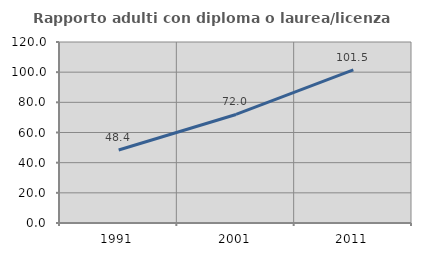
| Category | Rapporto adulti con diploma o laurea/licenza media  |
|---|---|
| 1991.0 | 48.41 |
| 2001.0 | 71.963 |
| 2011.0 | 101.474 |